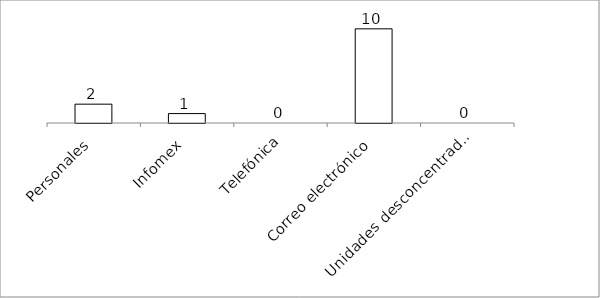
| Category | Series 0 |
|---|---|
| Personales | 2 |
| Infomex | 1 |
| Telefónica | 0 |
| Correo electrónico | 10 |
| Unidades desconcentradas | 0 |